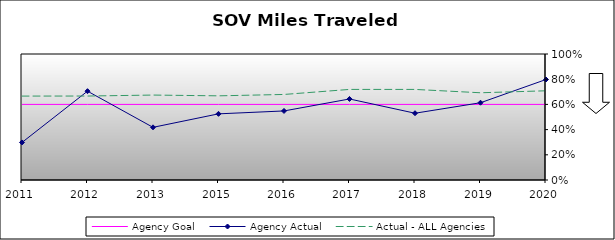
| Category | Agency Goal | Agency Actual | Actual - ALL Agencies |
|---|---|---|---|
| 2011.0 | 0.6 | 0.298 | 0.666 |
| 2012.0 | 0.6 | 0.705 | 0.666 |
| 2013.0 | 0.6 | 0.418 | 0.674 |
| 2015.0 | 0.6 | 0.525 | 0.668 |
| 2016.0 | 0.6 | 0.548 | 0.679 |
| 2017.0 | 0.6 | 0.643 | 0.719 |
| 2018.0 | 0.6 | 0.53 | 0.719 |
| 2019.0 | 0.6 | 0.613 | 0.692 |
| 2020.0 | 0.6 | 0.798 | 0.708 |